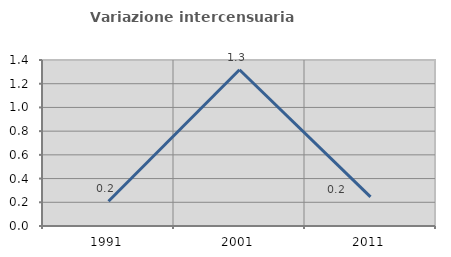
| Category | Variazione intercensuaria annua |
|---|---|
| 1991.0 | 0.209 |
| 2001.0 | 1.318 |
| 2011.0 | 0.246 |